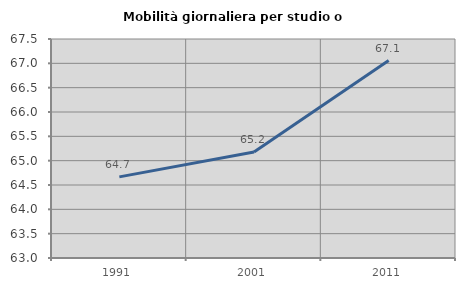
| Category | Mobilità giornaliera per studio o lavoro |
|---|---|
| 1991.0 | 64.667 |
| 2001.0 | 65.179 |
| 2011.0 | 67.057 |